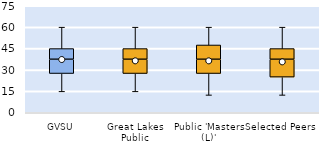
| Category | 25th | 50th | 75th |
|---|---|---|---|
| GVSU | 27.5 | 10 | 7.5 |
| Great Lakes Public | 27.5 | 10 | 7.5 |
| Public 'Masters (L)' | 27.5 | 10 | 10 |
| Selected Peers | 25 | 12.5 | 7.5 |